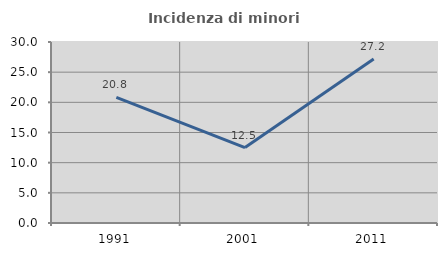
| Category | Incidenza di minori stranieri |
|---|---|
| 1991.0 | 20.833 |
| 2001.0 | 12.5 |
| 2011.0 | 27.184 |